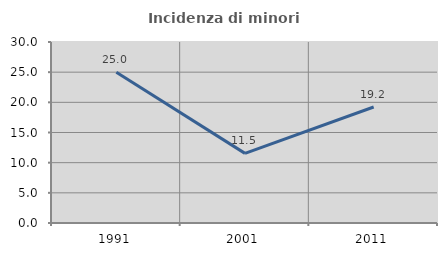
| Category | Incidenza di minori stranieri |
|---|---|
| 1991.0 | 25 |
| 2001.0 | 11.538 |
| 2011.0 | 19.231 |